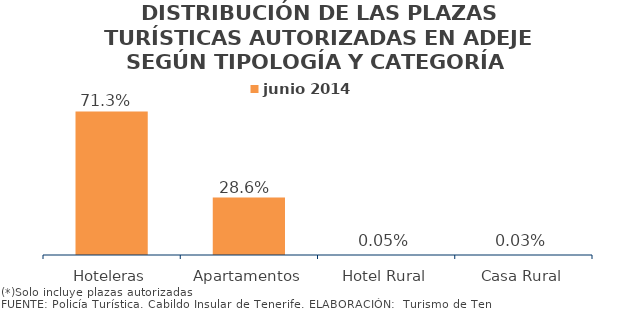
| Category | junio 2014 |
|---|---|
| Hoteleras | 0.713 |
| Apartamentos | 0.286 |
| Hotel Rural | 0 |
| Casa Rural | 0 |